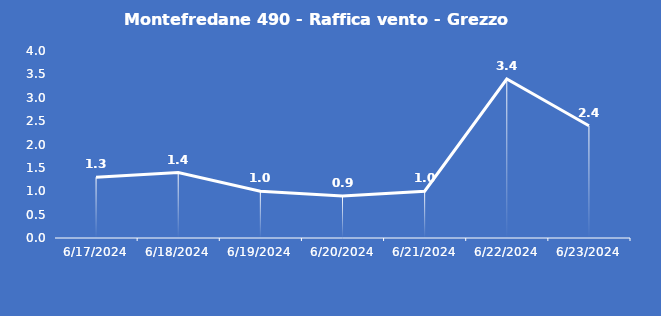
| Category | Montefredane 490 - Raffica vento - Grezzo (m/s) |
|---|---|
| 6/17/24 | 1.3 |
| 6/18/24 | 1.4 |
| 6/19/24 | 1 |
| 6/20/24 | 0.9 |
| 6/21/24 | 1 |
| 6/22/24 | 3.4 |
| 6/23/24 | 2.4 |